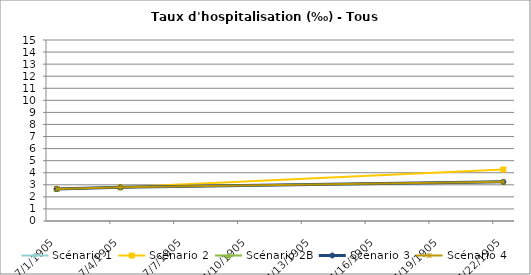
| Category | Scénario 1 | Scénario 2 | Scénario 2B | Scénario 3 | Scénario 4 |
|---|---|---|---|---|---|
| 2009.0 | 2.659 | 2.659 | 2.659 | 2.659 | 2.659 |
| 2012.0 | 2.796 | 2.796 | 2.796 | 2.796 | 2.796 |
| 2030.0 | 3.243 | 4.269 | 3.243 | 3.243 | 3.243 |